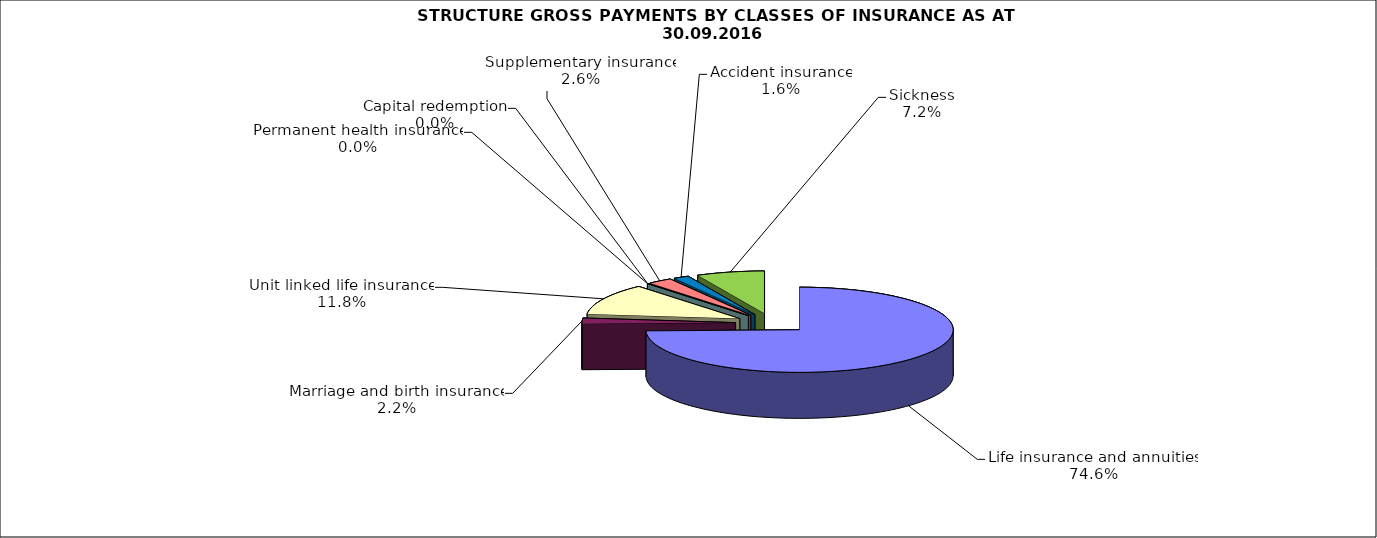
| Category | Series 0 |
|---|---|
| Life insurance and annuities | 92252430.169 |
| Marriage and birth insurance | 2667462.667 |
| Unit linked life insurance | 14638205.86 |
| Permanent health insurance | 40858.14 |
| Capital redemption | 0 |
| Supplementary insurance | 3203486.375 |
| Accident insurance | 2022518.626 |
| Sickness | 8858137.29 |